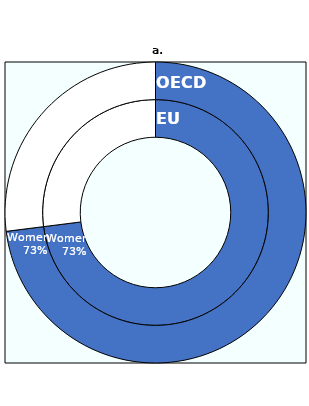
| Category | EU | OECD |
|---|---|---|
| Women | 0.73 | 0.73 |
| Men | 0.27 | 0.27 |